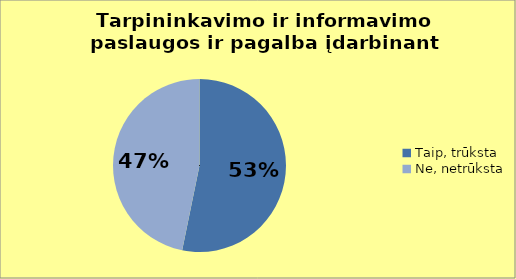
| Category | Series 0 |
|---|---|
| Taip, trūksta | 58 |
| Ne, netrūksta | 51 |